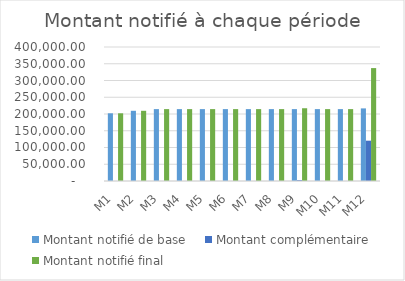
| Category | Montant notifié de base | Montant complémentaire | Montant notifié final |
|---|---|---|---|
| M1 | 202113.41 | 0 | 202113.41 |
| M2 | 209581.43 | 0 | 209581.43 |
| M3 | 214595 | 0 | 214595 |
| M4 | 214595 | 0 | 214595 |
| M5 | 214595 | 0 | 214595 |
| M6 | 214595 | 0 | 214595 |
| M7 | 214595 | 0 | 214595 |
| M8 | 214595 | 0 | 214595 |
| M9 | 214595 | 2591.53 | 217186.53 |
| M10 | 214595 | 0 | 214595 |
| M11 | 214595 | 0 | 214595 |
| M12 | 216740.95 | 120306.12 | 337047.07 |